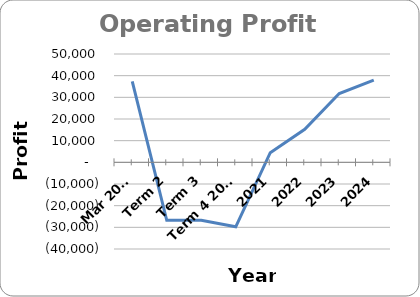
| Category | Series 0 |
|---|---|
| Mar 2020 | 37334.13 |
| Term 2 | -26761 |
| Term 3 | -26761 |
| Term 4 2020 | -29761 |
| 2021 | 4446.7 |
| 2022 | 15241.943 |
| 2023 | 31732.066 |
| 2024 | 37979.443 |